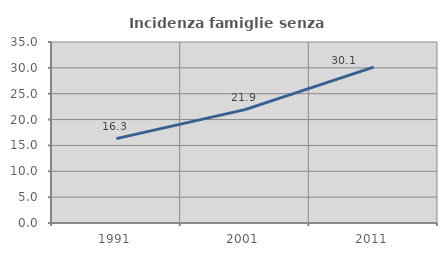
| Category | Incidenza famiglie senza nuclei |
|---|---|
| 1991.0 | 16.315 |
| 2001.0 | 21.926 |
| 2011.0 | 30.133 |